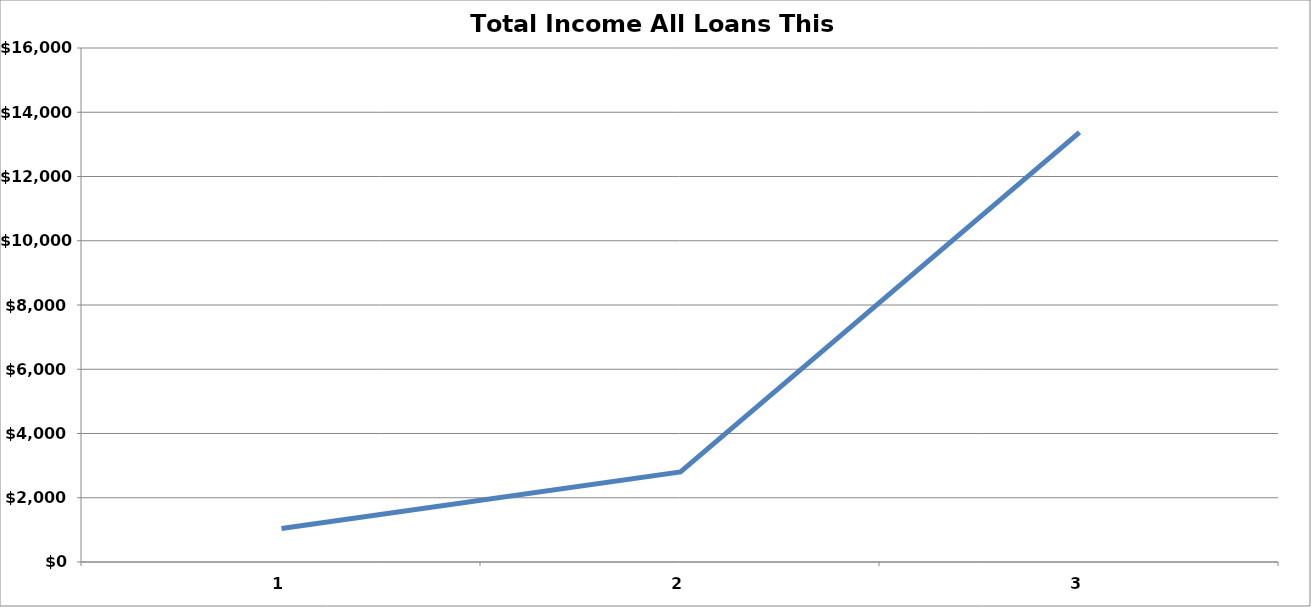
| Category | Total Income All Loans This Type |
|---|---|
| 0 | 1043.041 |
| 1 | 2805.894 |
| 2 | 13372.775 |